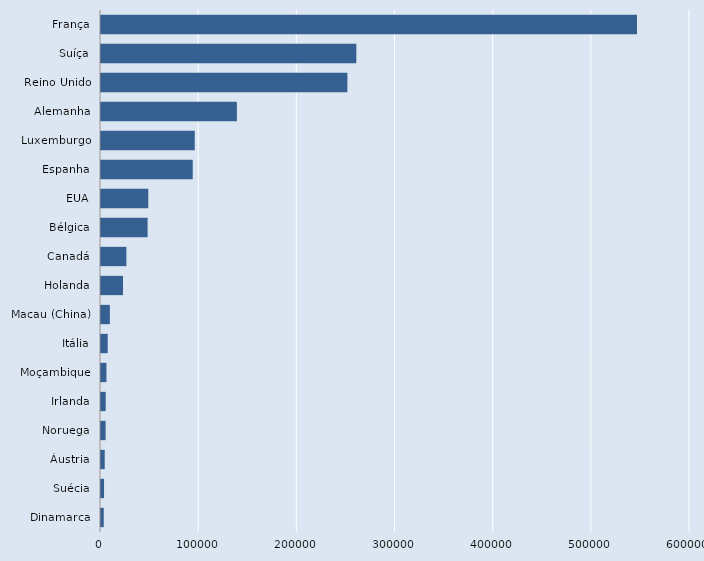
| Category | Series 0 |
|---|---|
| Dinamarca | 2806 |
| Suécia | 3101 |
| Áustria | 3789 |
| Noruega | 4699 |
| Irlanda | 4807 |
| Moçambique | 5560 |
| Itália | 6845 |
| Macau (China) | 9024 |
| Holanda | 22398 |
| Canadá | 25855 |
| Bélgica | 47465 |
| EUA | 48158 |
| Espanha | 93440 |
| Luxemburgo | 95500 |
| Alemanha | 138410 |
| Reino Unido | 251000 |
| Suíça | 260100 |
| França | 546000 |